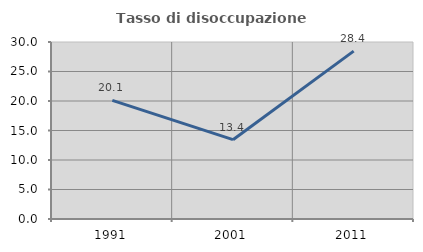
| Category | Tasso di disoccupazione giovanile  |
|---|---|
| 1991.0 | 20.105 |
| 2001.0 | 13.445 |
| 2011.0 | 28.448 |